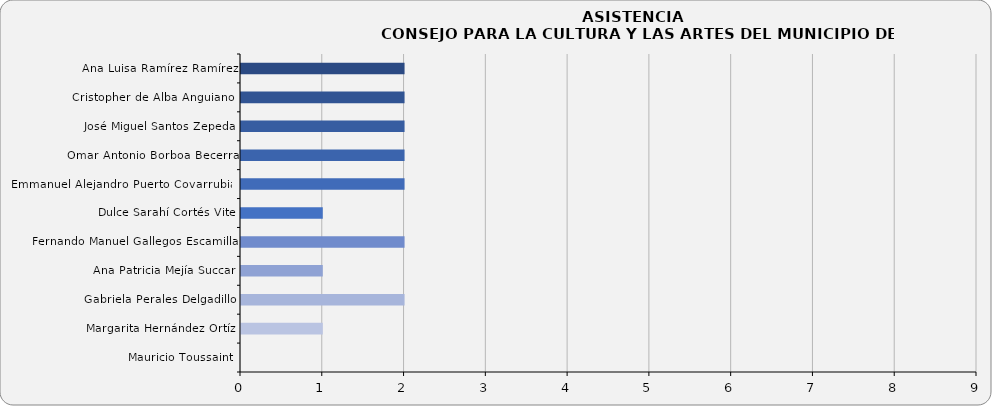
| Category | Series 0 |
|---|---|
| Ana Luisa Ramírez Ramírez | 2 |
| Cristopher de Alba Anguiano  | 2 |
| José Miguel Santos Zepeda | 2 |
| Omar Antonio Borboa Becerra | 2 |
| Emmanuel Alejandro Puerto Covarrubias | 2 |
| Dulce Sarahí Cortés Vite | 1 |
| Fernando Manuel Gallegos Escamilla | 2 |
| Ana Patricia Mejía Succar | 1 |
| Gabriela Perales Delgadillo | 2 |
| Margarita Hernández Ortíz | 1 |
| Mauricio Toussaint | 0 |